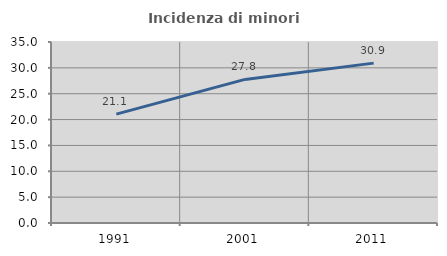
| Category | Incidenza di minori stranieri |
|---|---|
| 1991.0 | 21.053 |
| 2001.0 | 27.767 |
| 2011.0 | 30.917 |